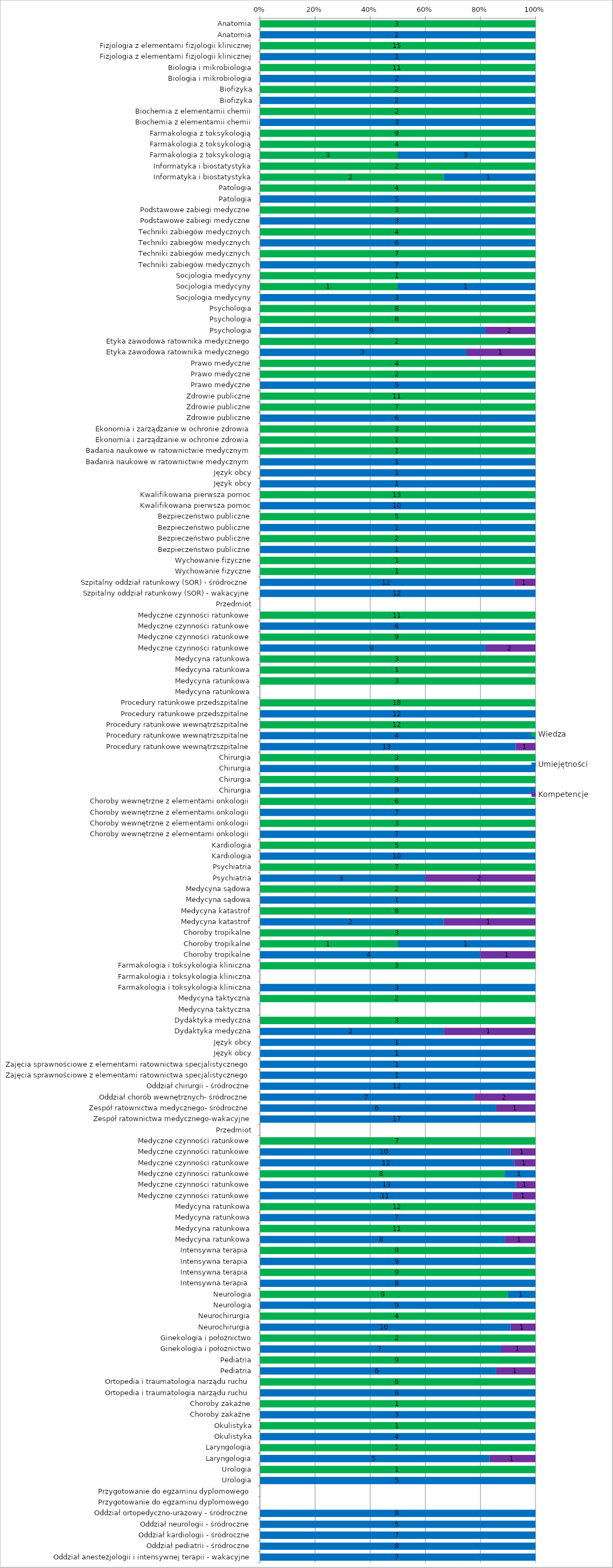
| Category | Wiedza | Umiejętności | Kompetencje |
|---|---|---|---|
| Anatomia | 3 | 0 | 0 |
| Anatomia | 0 | 2 | 0 |
| Fizjologia z elementami fizjologii klinicznej | 15 | 0 | 0 |
| Fizjologia z elementami fizjologii klinicznej | 0 | 1 | 0 |
| Biologia i mikrobiologia | 11 | 0 | 0 |
| Biologia i mikrobiologia | 0 | 2 | 0 |
| Biofizyka | 2 | 0 | 0 |
| Biofizyka | 0 | 2 | 0 |
| Biochemia z elementamii chemii | 2 | 0 | 0 |
| Biochemia z elementamii chemii | 0 | 3 | 0 |
| Farmakologia z toksykologią | 9 | 0 | 0 |
| Farmakologia z toksykologią | 4 | 0 | 0 |
| Farmakologia z toksykologią | 3 | 3 | 0 |
| Informatyka i biostatystyka | 2 | 0 | 0 |
| Informatyka i biostatystyka | 2 | 1 | 0 |
| Patologia | 4 | 0 | 0 |
| Patologia | 0 | 5 | 0 |
| Podstawowe zabiegi medyczne | 3 | 0 | 0 |
| Podstawowe zabiegi medyczne | 0 | 3 | 0 |
| Techniki zabiegów medycznych | 4 | 0 | 0 |
| Techniki zabiegów medycznych | 0 | 6 | 0 |
| Techniki zabiegów medycznych | 7 | 0 | 0 |
| Techniki zabiegów medycznych | 0 | 7 | 0 |
| Socjologia medycyny | 1 | 0 | 0 |
| Socjologia medycyny | 1 | 1 | 0 |
| Socjologia medycyny | 0 | 3 | 0 |
| Psychologia | 8 | 0 | 0 |
| Psychologia | 8 | 0 | 0 |
| Psychologia | 0 | 9 | 2 |
| Etyka zawodowa ratownika medycznego | 2 | 0 | 0 |
| Etyka zawodowa ratownika medycznego | 0 | 3 | 1 |
| Prawo medyczne | 4 | 0 | 0 |
| Prawo medyczne | 2 | 0 | 0 |
| Prawo medyczne | 0 | 5 | 0 |
| Zdrowie publiczne | 11 | 0 | 0 |
| Zdrowie publiczne | 7 | 0 | 0 |
| Zdrowie publiczne | 0 | 6 | 0 |
| Ekonomia i zarządzanie w ochronie zdrowia | 3 | 0 | 0 |
| Ekonomia i zarządzanie w ochronie zdrowia | 1 | 0 | 0 |
| Badania naukowe w ratownictwie medycznym | 1 | 0 | 0 |
| Badania naukowe w ratownictwie medycznym | 0 | 1 | 0 |
| Język obcy | 0 | 1 | 0 |
| Język obcy | 0 | 1 | 0 |
| Kwalifikowana pierwsza pomoc | 13 | 0 | 0 |
| Kwalifikowana pierwsza pomoc | 0 | 10 | 0 |
| Bezpieczeństwo publiczne | 5 | 0 | 0 |
| Bezpieczeństwo publiczne | 0 | 1 | 0 |
| Bezpieczeństwo publiczne | 2 | 0 | 0 |
| Bezpieczeństwo publiczne | 0 | 1 | 0 |
| Wychowanie fizyczne | 1 | 0 | 0 |
| Wychowanie fizyczne | 1 | 0 | 0 |
| Szpitalny oddział ratunkowy (SOR) - śródroczne | 0 | 12 | 1 |
| Szpitalny oddział ratunkowy (SOR) - wakacyjne | 0 | 12 | 0 |
| Przedmiot | 0 | 0 | 0 |
| Medyczne czynności ratunkowe | 11 | 0 | 0 |
| Medyczne czynności ratunkowe | 0 | 6 | 0 |
| Medyczne czynności ratunkowe | 9 | 0 | 0 |
| Medyczne czynności ratunkowe | 0 | 9 | 2 |
| Medycyna ratunkowa | 3 | 0 | 0 |
| Medycyna ratunkowa | 1 | 0 | 0 |
| Medycyna ratunkowa | 3 | 0 | 0 |
| Medycyna ratunkowa | 0 | 0 | 0 |
| Procedury ratunkowe przedszpitalne | 18 | 0 | 0 |
| Procedury ratunkowe przedszpitalne | 0 | 12 | 0 |
| Procedury ratunkowe wewnątrzszpitalne | 12 | 0 | 0 |
| Procedury ratunkowe wewnątrzszpitalne | 0 | 4 | 0 |
| Procedury ratunkowe wewnątrzszpitalne | 0 | 13 | 1 |
| Chirurgia | 3 | 0 | 0 |
| Chirurgia | 0 | 6 | 0 |
| Chirurgia | 3 | 0 | 0 |
| Chirurgia | 0 | 9 | 0 |
| Choroby wewnętrzne z elementami onkologii | 6 | 0 | 0 |
| Choroby wewnętrzne z elementami onkologii | 0 | 7 | 0 |
| Choroby wewnętrzne z elementami onkologii | 3 | 0 | 0 |
| Choroby wewnętrzne z elementami onkologii | 0 | 7 | 0 |
| Kardiologia | 5 | 0 | 0 |
| Kardiologia | 0 | 10 | 0 |
| Psychiatria | 7 | 0 | 0 |
| Psychiatria | 0 | 3 | 2 |
| Medycyna sądowa | 2 | 0 | 0 |
| Medycyna sądowa | 0 | 1 | 0 |
| Medycyna katastrof | 8 | 0 | 0 |
| Medycyna katastrof | 0 | 2 | 1 |
| Choroby tropikalne | 3 | 0 | 0 |
| Choroby tropikalne | 1 | 1 | 0 |
| Choroby tropikalne | 0 | 4 | 1 |
| Farmakologia i toksykologia kliniczna | 3 | 0 | 0 |
| Farmakologia i toksykologia kliniczna | 0 | 0 | 0 |
| Farmakologia i toksykologia kliniczna | 0 | 3 | 0 |
| Medycyna taktyczna | 2 | 0 | 0 |
| Medycyna taktyczna | 0 | 0 | 0 |
| Dydaktyka medyczna | 3 | 0 | 0 |
| Dydaktyka medyczna | 0 | 2 | 1 |
| Język obcy | 0 | 1 | 0 |
| Język obcy | 0 | 1 | 0 |
| Zajęcia sprawnościowe z elementami ratownictwa specjalistycznego | 0 | 1 | 0 |
| Zajęcia sprawnościowe z elementami ratownictwa specjalistycznego | 0 | 1 | 0 |
| Oddział chirurgii - śródroczne | 0 | 12 | 0 |
| Oddział chorób wewnętrznych- śródroczne | 0 | 7 | 2 |
| Zespół ratownictwa medycznego- śródroczne | 0 | 6 | 1 |
| Zespół ratownictwa medycznego-wakacyjne | 0 | 17 | 0 |
| Przedmiot | 0 | 0 | 0 |
| Medyczne czynności ratunkowe | 7 | 0 | 0 |
| Medyczne czynności ratunkowe | 0 | 10 | 1 |
| Medyczne czynności ratunkowe | 0 | 12 | 1 |
| Medyczne czynności ratunkowe | 8 | 1 | 0 |
| Medyczne czynności ratunkowe | 0 | 13 | 1 |
| Medyczne czynności ratunkowe | 0 | 11 | 1 |
| Medycyna ratunkowa | 12 | 0 | 0 |
| Medycyna ratunkowa | 0 | 7 | 0 |
| Medycyna ratunkowa | 11 | 0 | 0 |
| Medycyna ratunkowa | 0 | 8 | 1 |
| Intensywna terapia  | 9 | 0 | 0 |
| Intensywna terapia  | 0 | 9 | 0 |
| Intensywna terapia  | 9 | 0 | 0 |
| Intensywna terapia  | 0 | 8 | 0 |
| Neurologia | 9 | 1 | 0 |
| Neurologia | 0 | 9 | 0 |
| Neurochirurgia | 4 | 0 | 0 |
| Neurochirurgia | 0 | 10 | 1 |
| Ginekologia i położnictwo | 2 | 0 | 0 |
| Ginekologia i położnictwo | 0 | 7 | 1 |
| Pediatria | 9 | 0 | 0 |
| Pediatria | 0 | 6 | 1 |
| Ortopedia i traumatologia narządu ruchu | 6 | 0 | 0 |
| Ortopedia i traumatologia narządu ruchu | 0 | 6 | 0 |
| Choroby zakaźne | 1 | 0 | 0 |
| Choroby zakaźne | 0 | 3 | 0 |
| Okulistyka | 1 | 0 | 0 |
| Okulistyka | 0 | 4 | 0 |
| Laryngologia | 1 | 0 | 0 |
| Laryngologia | 0 | 5 | 1 |
| Urologia | 1 | 0 | 0 |
| Urologia | 0 | 5 | 0 |
| Przygotowanie do egzaminu dyplomowego | 0 | 0 | 0 |
| Przygotowanie do egzaminu dyplomowego | 0 | 0 | 0 |
| Oddział ortopedyczno-urazowy - śródroczne | 0 | 8 | 0 |
| Oddział neurologii - śródroczne | 0 | 5 | 0 |
| Oddział kardiologii - śródroczne | 0 | 7 | 0 |
| Oddział pediatrii - śródroczne | 0 | 8 | 0 |
| Oddział anestezjologii i intensywnej terapii - wakacyjne | 0 | 7 | 0 |